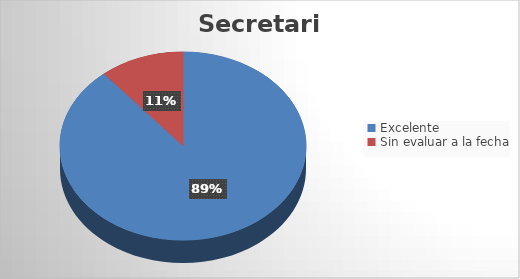
| Category | Cantidad |
|---|---|
| Excelente | 8 |
| Sin evaluar a la fecha | 1 |